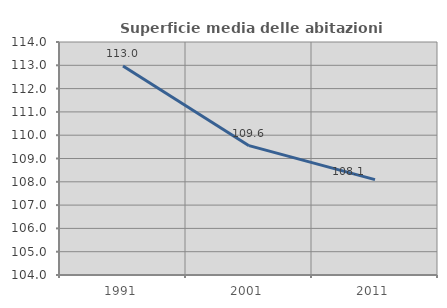
| Category | Superficie media delle abitazioni occupate |
|---|---|
| 1991.0 | 112.968 |
| 2001.0 | 109.55 |
| 2011.0 | 108.094 |